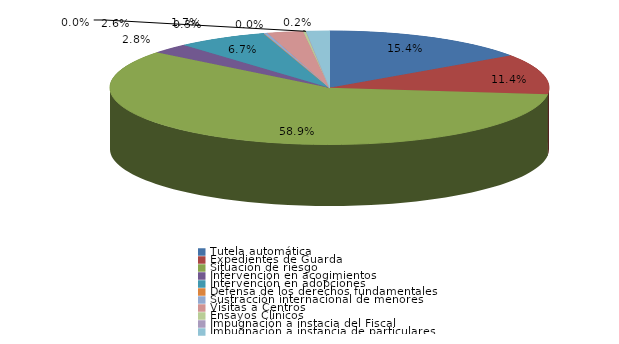
| Category | Series 0 |
|---|---|
| Tutela automática | 217 |
| Expedientes de Guarda | 161 |
| Situación de riesgo | 830 |
| Intervención en acogimientos | 40 |
| Intervención en adopciones | 94 |
| Defensa de los derechos fundamentales | 0 |
| Sustracción internacional de menores | 4 |
| Visitas a Centros | 37 |
| Ensayos Clínicos | 3 |
| Impugnación a instacia del Fiscal | 0 |
| Impugnación a instancia de particulares | 24 |